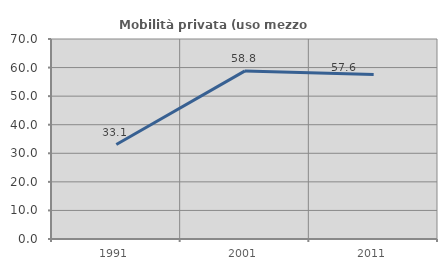
| Category | Mobilità privata (uso mezzo privato) |
|---|---|
| 1991.0 | 33.061 |
| 2001.0 | 58.832 |
| 2011.0 | 57.601 |